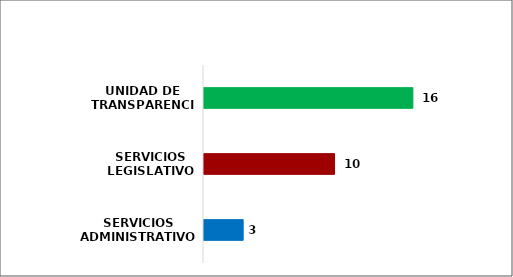
| Category | Series 0 |
|---|---|
| SERVICIOS ADMINISTRATIVOS | 3 |
| SERVICIOS LEGISLATIVOS | 10 |
| UNIDAD DE TRANSPARENCIA | 16 |